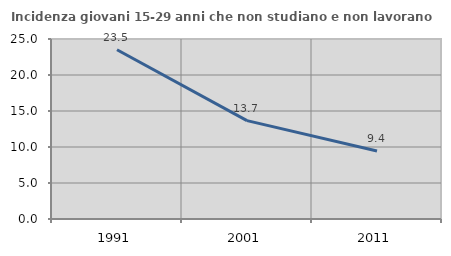
| Category | Incidenza giovani 15-29 anni che non studiano e non lavorano  |
|---|---|
| 1991.0 | 23.503 |
| 2001.0 | 13.667 |
| 2011.0 | 9.434 |